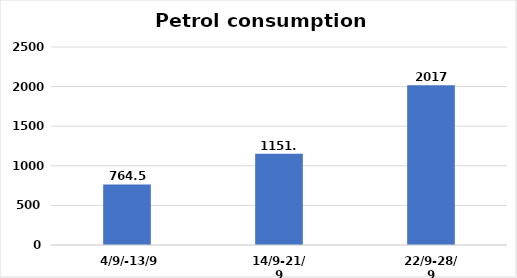
| Category | Petrol consumption (JD)  |
|---|---|
| 4/9/-13/9 | 764.5 |
| 14/9-21/9 | 1151.5 |
| 22/9-28/9 | 2017 |